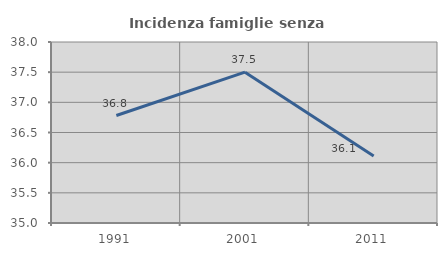
| Category | Incidenza famiglie senza nuclei |
|---|---|
| 1991.0 | 36.782 |
| 2001.0 | 37.5 |
| 2011.0 | 36.111 |